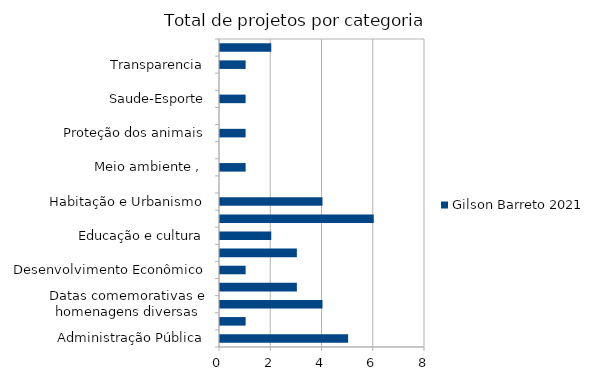
| Category | Gilson Barreto 2021 |
|---|---|
| Administração Pública | 5 |
| Combate à corrupção  | 1 |
| Datas comemorativas e homenagens diversas | 4 |
| Denominação de logradouro | 3 |
| Desenvolvimento Econômico | 1 |
| Desenvolvimento Social  | 3 |
| Educação e cultura | 2 |
| Frente parlamentar | 6 |
| Habitação e Urbanismo | 4 |
| Lei Orgânica do Município | 0 |
| Meio ambiente ,  | 1 |
| Mobilidade | 0 |
| Proteção dos animais | 1 |
| Regimento Interno da CMSP | 0 |
| Saude-Esporte | 1 |
| Segurança Pública | 0 |
| Transparencia | 1 |
| Tributação | 2 |